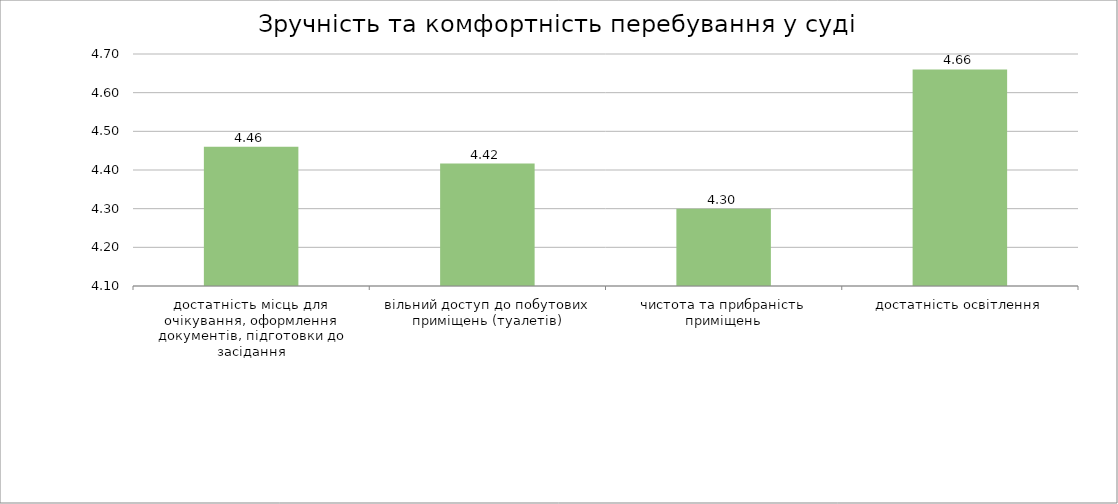
| Category | Series 0 |
|---|---|
| достатність місць для очікування, оформлення документів, підготовки до засідання | 4.46 |
| вільний доступ до побутових приміщень (туалетів) | 4.417 |
| чистота та прибраність приміщень | 4.3 |
| достатність освітлення | 4.66 |